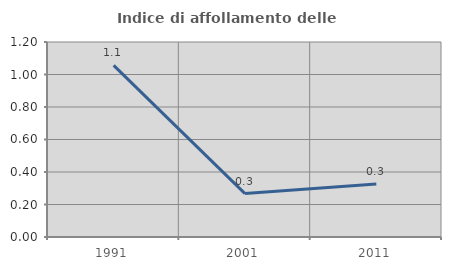
| Category | Indice di affollamento delle abitazioni  |
|---|---|
| 1991.0 | 1.056 |
| 2001.0 | 0.267 |
| 2011.0 | 0.327 |